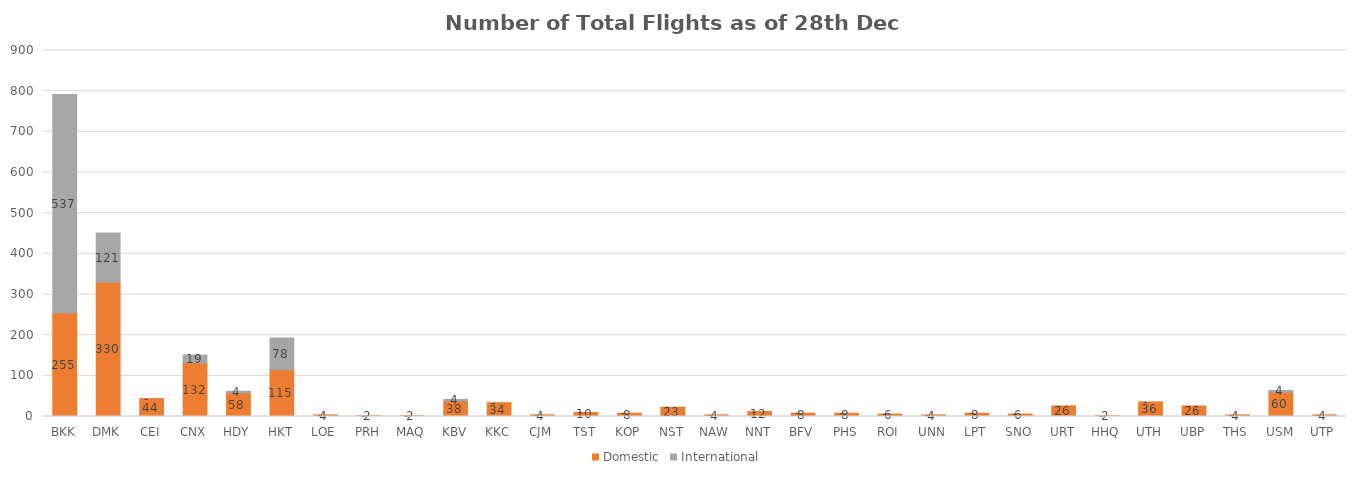
| Category | Domestic | International |
|---|---|---|
| BKK | 255 | 537 |
| DMK | 330 | 121 |
| CEI | 44 | 0 |
| CNX | 132 | 19 |
| HDY | 58 | 4 |
| HKT | 115 | 78 |
| LOE | 4 | 0 |
| PRH | 2 | 0 |
| MAQ | 2 | 0 |
| KBV | 38 | 4 |
| KKC | 34 | 0 |
| CJM | 4 | 0 |
| TST | 10 | 0 |
| KOP | 8 | 0 |
| NST | 23 | 0 |
| NAW | 4 | 0 |
| NNT | 12 | 0 |
| BFV | 8 | 0 |
| PHS | 8 | 0 |
| ROI | 6 | 0 |
| UNN | 4 | 0 |
| LPT | 8 | 0 |
| SNO | 6 | 0 |
| URT | 26 | 0 |
| HHQ | 2 | 0 |
| UTH | 36 | 0 |
| UBP | 26 | 0 |
| THS | 4 | 0 |
| USM | 60 | 4 |
| UTP | 4 | 0 |